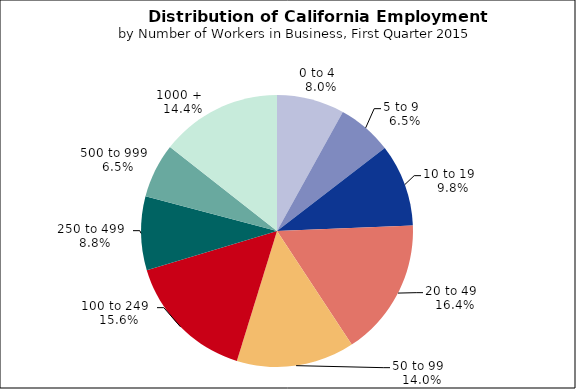
| Category | Series 0 |
|---|---|
| 0 to 4   | 0.08 |
| 5 to 9   | 0.065 |
| 10 to 19   | 0.098 |
| 20 to 49   | 0.164 |
| 50 to 99   | 0.14 |
| 100 to 249   | 0.156 |
| 250 to 499   | 0.088 |
| 500 to 999   | 0.065 |
| 1000 +   | 0.144 |